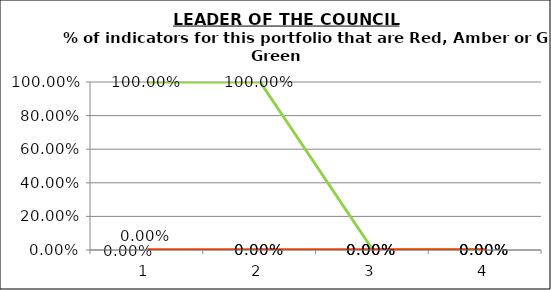
| Category | Green | Amber | Red |
|---|---|---|---|
| 0 | 1 | 0 | 0 |
| 1 | 1 | 0 | 0 |
| 2 | 0 | 0 | 0 |
| 3 | 0 | 0 | 0 |